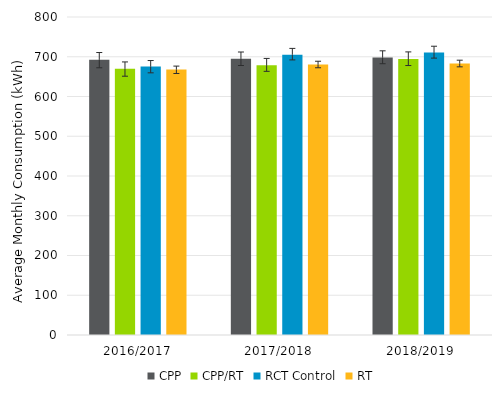
| Category | CPP | CPP/RT | RCT Control | RT |
|---|---|---|---|---|
| 2016/2017 | 692.31 | 669.964 | 675.41 | 668.089 |
| 2017/2018 | 694.73 | 678.882 | 705.289 | 680.63 |
| 2018/2019 | 698.024 | 694.071 | 710.525 | 683.271 |